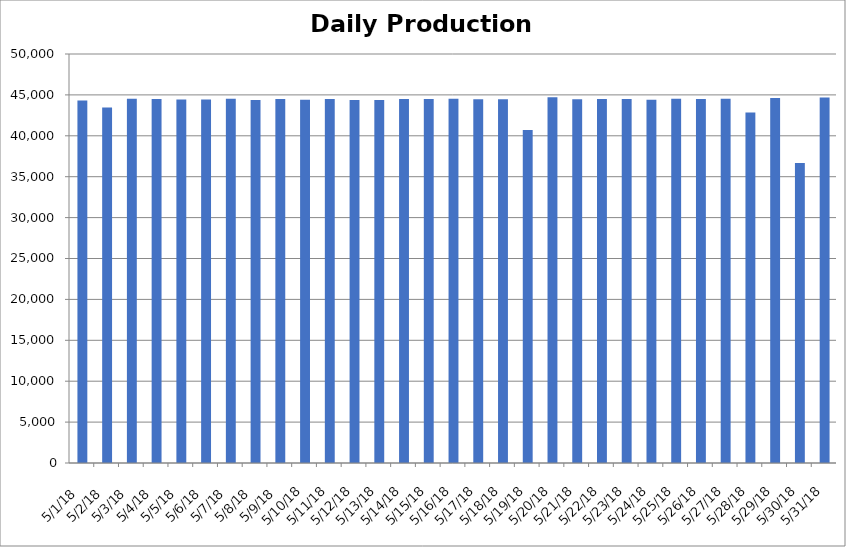
| Category | Series 0 |
|---|---|
| 5/1/18 | 44321 |
| 5/2/18 | 43467 |
| 5/3/18 | 44530 |
| 5/4/18 | 44499 |
| 5/5/18 | 44425 |
| 5/6/18 | 44445 |
| 5/7/18 | 44541 |
| 5/8/18 | 44372 |
| 5/9/18 | 44504 |
| 5/10/18 | 44406 |
| 5/11/18 | 44493 |
| 5/12/18 | 44387 |
| 5/13/18 | 44390 |
| 5/14/18 | 44487 |
| 5/15/18 | 44504 |
| 5/16/18 | 44541 |
| 5/17/18 | 44478 |
| 5/18/18 | 44457 |
| 5/19/18 | 40713 |
| 5/20/18 | 44709 |
| 5/21/18 | 44483 |
| 5/22/18 | 44511 |
| 5/23/18 | 44509 |
| 5/24/18 | 44422 |
| 5/25/18 | 44516 |
| 5/26/18 | 44484 |
| 5/27/18 | 44528 |
| 5/28/18 | 42859 |
| 5/29/18 | 44627 |
| 5/30/18 | 36668 |
| 5/31/18 | 44678 |